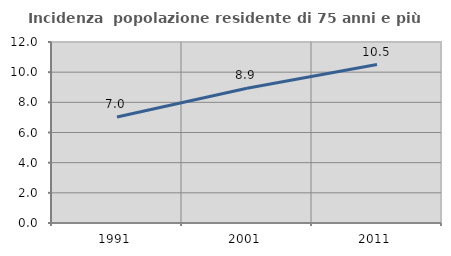
| Category | Incidenza  popolazione residente di 75 anni e più |
|---|---|
| 1991.0 | 7.023 |
| 2001.0 | 8.932 |
| 2011.0 | 10.507 |